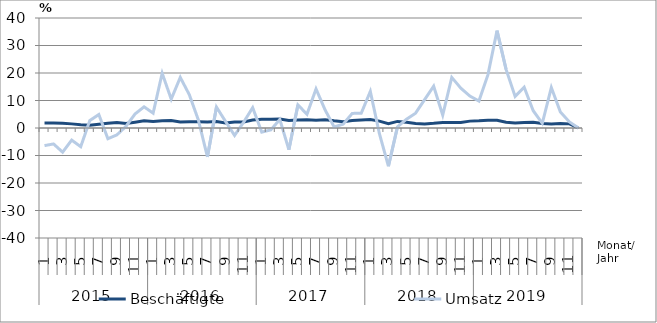
| Category | Beschäftigte | Umsatz |
|---|---|---|
| 0 | 1.8 | -6.4 |
| 1 | 1.8 | -5.8 |
| 2 | 1.7 | -8.8 |
| 3 | 1.5 | -4.4 |
| 4 | 1.2 | -6.8 |
| 5 | 1 | 2.7 |
| 6 | 1.4 | 4.9 |
| 7 | 1.7 | -3.9 |
| 8 | 2 | -2.5 |
| 9 | 1.6 | 0.6 |
| 10 | 2.1 | 5.1 |
| 11 | 2.6 | 7.7 |
| 12 | 2.4 | 5.4 |
| 13 | 2.6 | 19.9 |
| 14 | 2.7 | 10.5 |
| 15 | 2.2 | 18.4 |
| 16 | 2.3 | 12.1 |
| 17 | 2.3 | 2.9 |
| 18 | 2.2 | -10.5 |
| 19 | 2.4 | 7.6 |
| 20 | 1.8 | 2.4 |
| 21 | 2.2 | -2.7 |
| 22 | 2.2 | 2.1 |
| 23 | 2.9 | 7.4 |
| 24 | 3.2 | -1.5 |
| 25 | 3.2 | -0.7 |
| 26 | 3.3 | 3.1 |
| 27 | 2.7 | -7.9 |
| 28 | 2.9 | 8.4 |
| 29 | 3 | 5 |
| 30 | 2.8 | 14.2 |
| 31 | 3 | 6.6 |
| 32 | 2.6 | 0.4 |
| 33 | 2.3 | 1.4 |
| 34 | 2.7 | 5.3 |
| 35 | 2.9 | 5.4 |
| 36 | 3.1 | 13.3 |
| 37 | 2.5 | -2 |
| 38 | 1.6 | -13.9 |
| 39 | 2.4 | 0.4 |
| 40 | 2.1 | 3.2 |
| 41 | 1.6 | 5.4 |
| 42 | 1.5 | 10.3 |
| 43 | 1.7 | 15.2 |
| 44 | 2 | 4.7 |
| 45 | 2 | 18.4 |
| 46 | 2 | 14.5 |
| 47 | 2.5 | 11.6 |
| 48 | 2.6 | 9.8 |
| 49 | 2.8 | 19.4 |
| 50 | 2.8 | 35.4 |
| 51 | 2.1 | 21.3 |
| 52 | 1.8 | 11.5 |
| 53 | 2 | 14.8 |
| 54 | 2.1 | 6.3 |
| 55 | 1.6 | 1.7 |
| 56 | 1.5 | 14.7 |
| 57 | 1.6 | 5.8 |
| 58 | 1.5 | 2.2 |
| 59 | 0 | 0 |